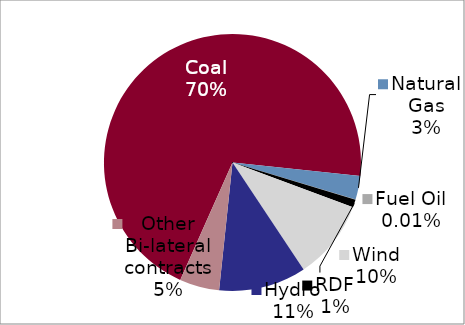
| Category | 2012 Generation |
|---|---|
| Coal | 0.7 |
| Natural Gas | 0.03 |
| Fuel Oil | 0 |
| RDF | 0.01 |
| Wind | 0.1 |
| Hydro | 0.11 |
| Other Bi-lateral contracts | 0.05 |